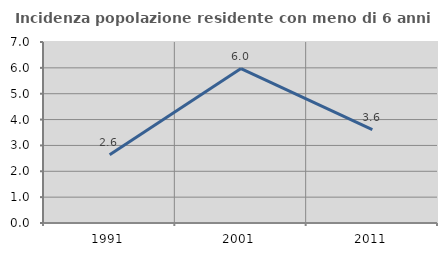
| Category | Incidenza popolazione residente con meno di 6 anni |
|---|---|
| 1991.0 | 2.637 |
| 2001.0 | 5.973 |
| 2011.0 | 3.608 |